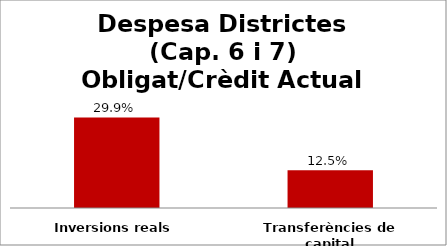
| Category | Series 0 |
|---|---|
| Inversions reals | 0.299 |
| Transferències de capital | 0.125 |